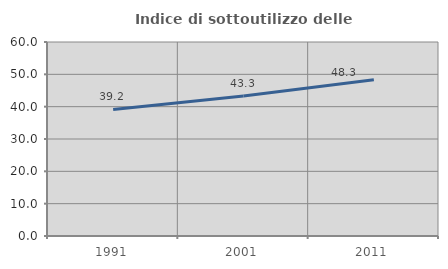
| Category | Indice di sottoutilizzo delle abitazioni  |
|---|---|
| 1991.0 | 39.157 |
| 2001.0 | 43.314 |
| 2011.0 | 48.323 |